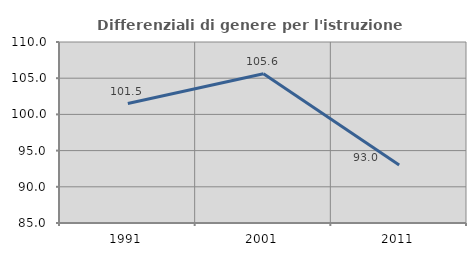
| Category | Differenziali di genere per l'istruzione superiore |
|---|---|
| 1991.0 | 101.499 |
| 2001.0 | 105.604 |
| 2011.0 | 93.02 |